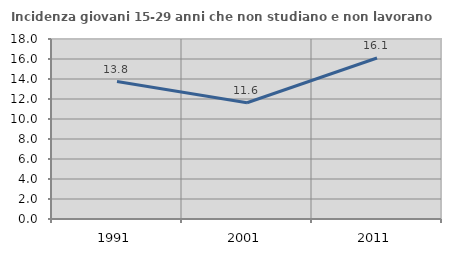
| Category | Incidenza giovani 15-29 anni che non studiano e non lavorano  |
|---|---|
| 1991.0 | 13.75 |
| 2001.0 | 11.628 |
| 2011.0 | 16.1 |